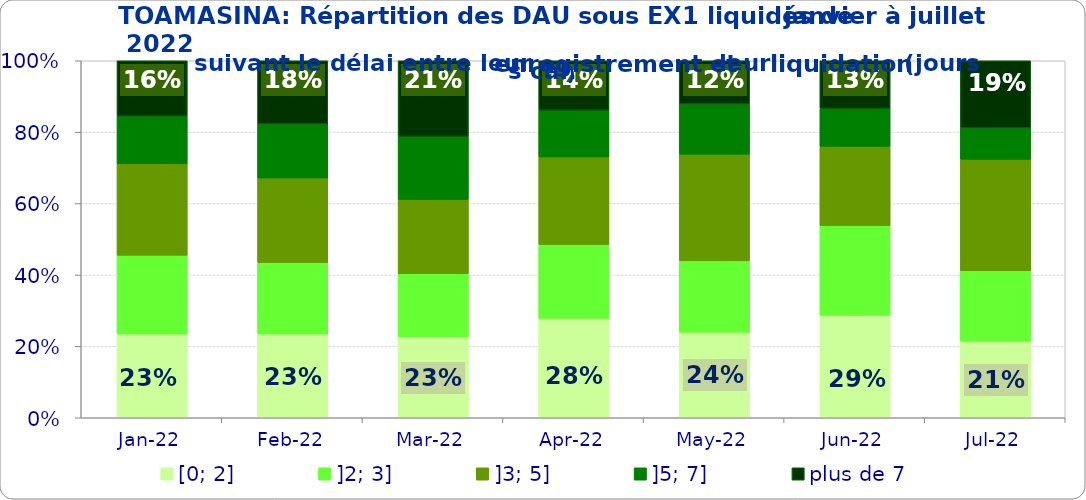
| Category | [0; 2] | ]2; 3] | ]3; 5] | ]5; 7] | plus de 7 |
|---|---|---|---|---|---|
| 2022-01-01 | 0.235 | 0.221 | 0.256 | 0.133 | 0.155 |
| 2022-02-01 | 0.235 | 0.2 | 0.236 | 0.152 | 0.177 |
| 2022-03-01 | 0.227 | 0.177 | 0.208 | 0.177 | 0.212 |
| 2022-04-01 | 0.278 | 0.207 | 0.245 | 0.131 | 0.138 |
| 2022-05-01 | 0.24 | 0.2 | 0.299 | 0.141 | 0.121 |
| 2022-06-01 | 0.287 | 0.251 | 0.222 | 0.106 | 0.134 |
| 2022-07-01 | 0.214 | 0.198 | 0.312 | 0.088 | 0.188 |